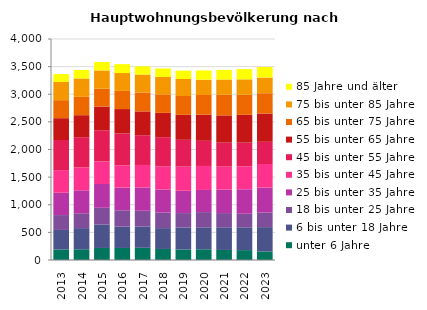
| Category | unter 6 Jahre | 6 bis unter 18 Jahre | 18 bis unter 25 Jahre | 25 bis unter 35 Jahre | 35 bis unter 45 Jahre | 45 bis unter 55 Jahre | 55 bis unter 65 Jahre | 65 bis unter 75 Jahre | 75 bis unter 85 Jahre | 85 Jahre und älter |
|---|---|---|---|---|---|---|---|---|---|---|
| 2013.0 | 191 | 353 | 269 | 404 | 410 | 545 | 395 | 326 | 329 | 143 |
| 2014.0 | 194 | 383 | 269 | 416 | 413 | 548 | 398 | 332 | 332 | 155 |
| 2015.0 | 218 | 425 | 302 | 431 | 407 | 566 | 428 | 323 | 332 | 152 |
| 2016.0 | 218 | 386 | 296 | 410 | 404 | 575 | 443 | 329 | 323 | 161 |
| 2017.0 | 221 | 386 | 284 | 422 | 407 | 539 | 431 | 341 | 326 | 149 |
| 2018.0 | 200 | 377 | 281 | 419 | 419 | 527 | 440 | 335 | 314 | 155 |
| 2019.0 | 191 | 398 | 260 | 404 | 437 | 485 | 452 | 341 | 308 | 152 |
| 2020.0 | 194 | 398 | 275 | 401 | 434 | 455 | 473 | 356 | 278 | 167 |
| 2021.0 | 182 | 410 | 257 | 425 | 416 | 434 | 494 | 374 | 275 | 173 |
| 2022.0 | 179 | 413 | 245 | 443 | 416 | 428 | 503 | 365 | 278 | 185 |
| 2023.0 | 155 | 440 | 266 | 449 | 428 | 401 | 512 | 368 | 284 | 191 |